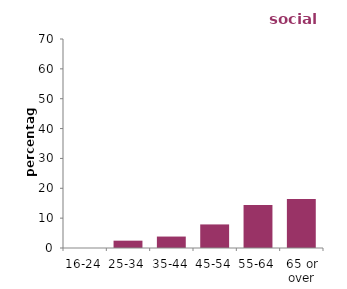
| Category | social
renters |
|---|---|
| 16-24 | 0 |
| 25-34 | 2.456 |
| 35-44 | 3.835 |
| 45-54 | 7.895 |
| 55-64 | 14.366 |
| 65 or over | 16.421 |